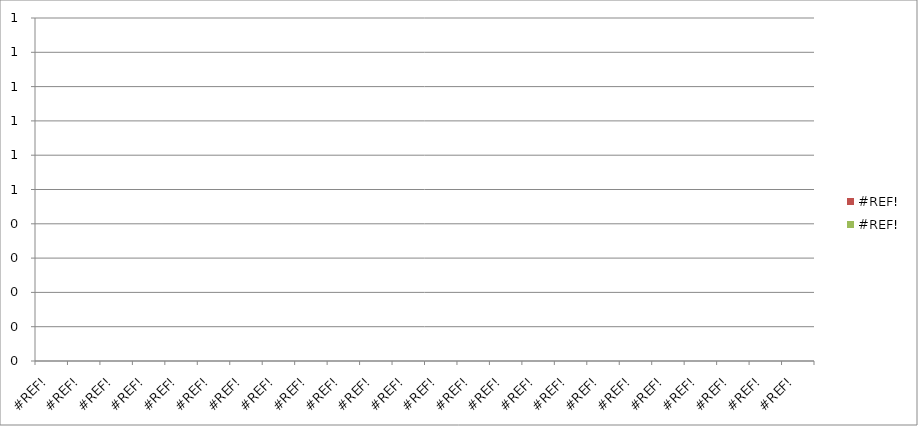
| Category | #REF! |
|---|---|
| 0.0 | 0 |
| 0.0 | 0 |
| 0.0 | 0 |
| 0.0 | 0 |
| 0.0 | 0 |
| 0.0 | 0 |
| 0.0 | 0 |
| 0.0 | 0 |
| 0.0 | 0 |
| 0.0 | 0 |
| 0.0 | 0 |
| 0.0 | 0 |
| 0.0 | 0 |
| 0.0 | 0 |
| 0.0 | 0 |
| 0.0 | 0 |
| 0.0 | 0 |
| 0.0 | 0 |
| 0.0 | 0 |
| 0.0 | 0 |
| 0.0 | 0 |
| 0.0 | 0 |
| 0.0 | 0 |
| 0.0 | 0 |